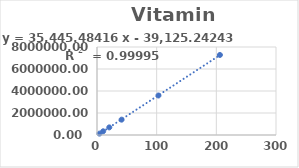
| Category | Series 0 |
|---|---|
| 4.119876 | 126098 |
| 10.29969 | 337416 |
| 20.59938 | 693114 |
| 41.19876 | 1394578 |
| 102.9969 | 3591071 |
| 205.9938 | 7276870 |